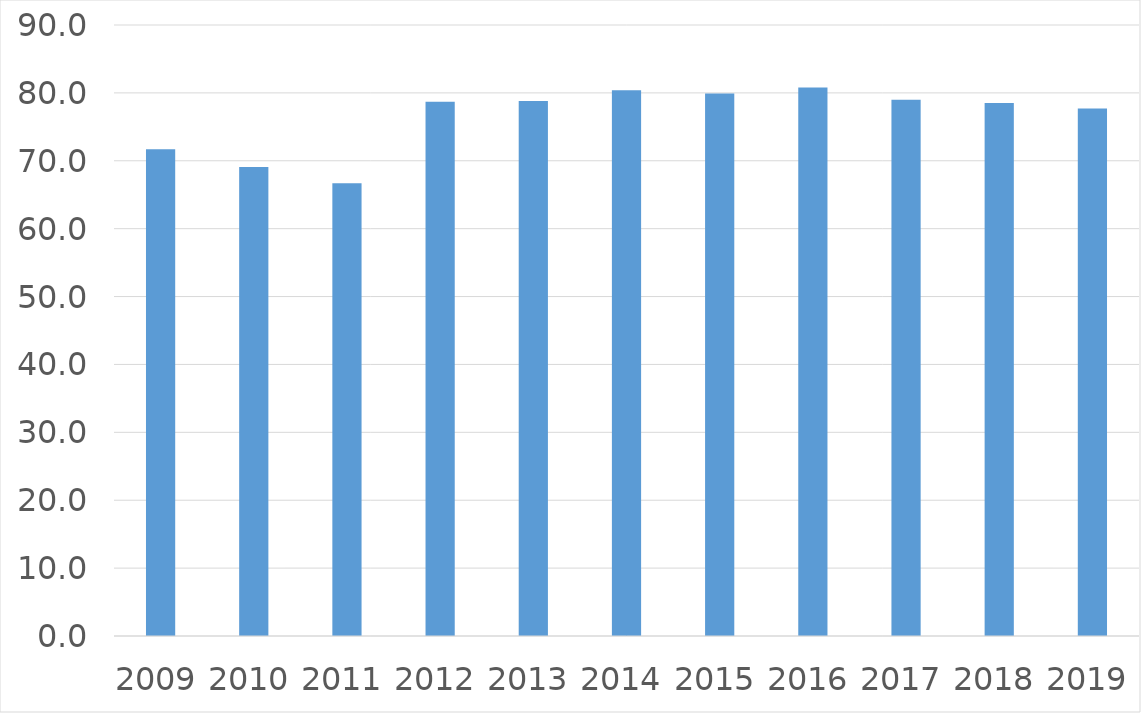
| Category | Series 0 |
|---|---|
| 2009 | 71.7 |
| 2010 | 69.1 |
| 2011 | 66.7 |
| 2012 | 78.7 |
| 2013 | 78.8 |
| 2014 | 80.4 |
| 2015 | 79.9 |
| 2016 | 80.8 |
| 2017 | 79 |
| 2018 | 78.5 |
| 2019 | 77.7 |